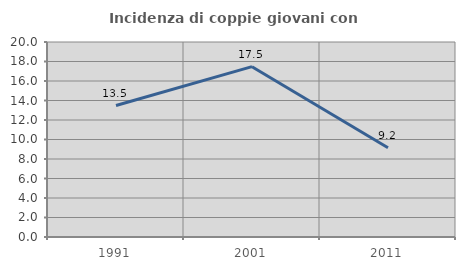
| Category | Incidenza di coppie giovani con figli |
|---|---|
| 1991.0 | 13.483 |
| 2001.0 | 17.47 |
| 2011.0 | 9.155 |